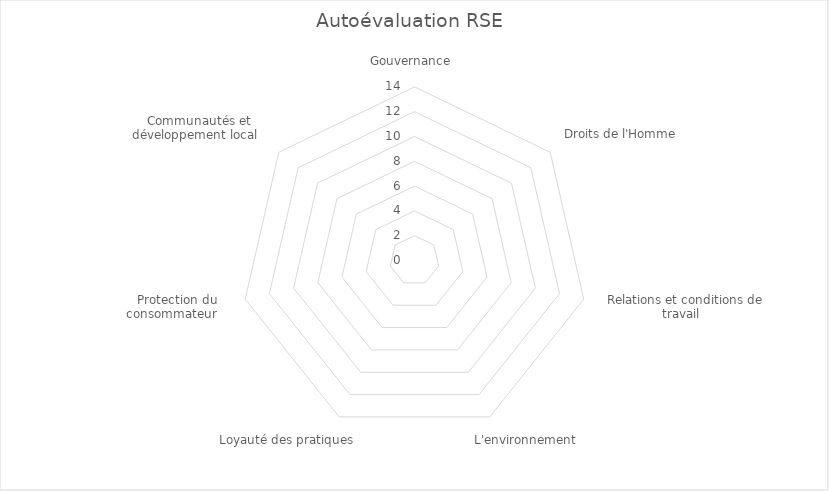
| Category | Series 0 |
|---|---|
| Gouvernance  | 0 |
| Droits de l'Homme  | 0 |
|  Relations et conditions de travail  | 0 |
| L'environnement  | 0 |
| Loyauté des pratiques  | 0 |
|  Protection du consommateur   | 0 |
|  Communautés et développement local  | 0 |